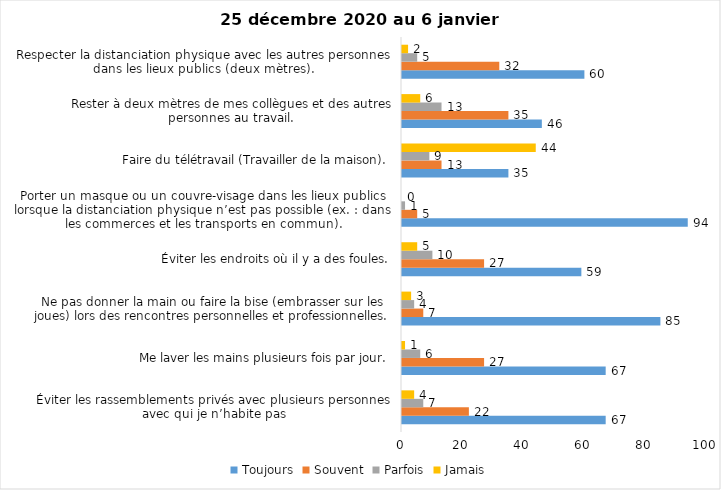
| Category | Toujours | Souvent | Parfois | Jamais |
|---|---|---|---|---|
| Éviter les rassemblements privés avec plusieurs personnes avec qui je n’habite pas | 67 | 22 | 7 | 4 |
| Me laver les mains plusieurs fois par jour. | 67 | 27 | 6 | 1 |
| Ne pas donner la main ou faire la bise (embrasser sur les joues) lors des rencontres personnelles et professionnelles. | 85 | 7 | 4 | 3 |
| Éviter les endroits où il y a des foules. | 59 | 27 | 10 | 5 |
| Porter un masque ou un couvre-visage dans les lieux publics lorsque la distanciation physique n’est pas possible (ex. : dans les commerces et les transports en commun). | 94 | 5 | 1 | 0 |
| Faire du télétravail (Travailler de la maison). | 35 | 13 | 9 | 44 |
| Rester à deux mètres de mes collègues et des autres personnes au travail. | 46 | 35 | 13 | 6 |
| Respecter la distanciation physique avec les autres personnes dans les lieux publics (deux mètres). | 60 | 32 | 5 | 2 |